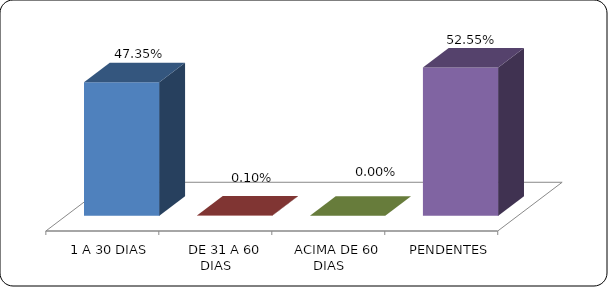
| Category | Series 0 |
|---|---|
|      1 A 30 DIAS | 0.474 |
|      DE 31 A 60 DIAS | 0.001 |
|      ACIMA DE 60 DIAS | 0 |
|      PENDENTES | 0.526 |